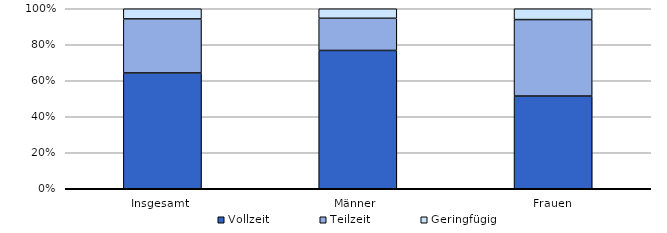
| Category | Vollzeit | Teilzeit | Geringfügig |
|---|---|---|---|
| Insgesamt  | 64.333 | 30.02 | 5.647 |
| Männer  | 76.839 | 17.872 | 5.289 |
| Frauen | 51.493 | 42.493 | 6.014 |